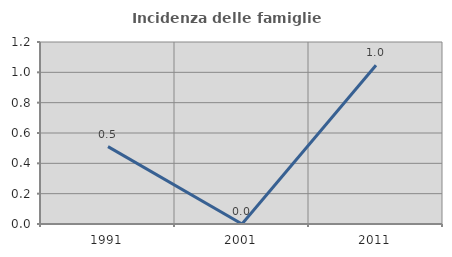
| Category | Incidenza delle famiglie numerose |
|---|---|
| 1991.0 | 0.51 |
| 2001.0 | 0 |
| 2011.0 | 1.047 |